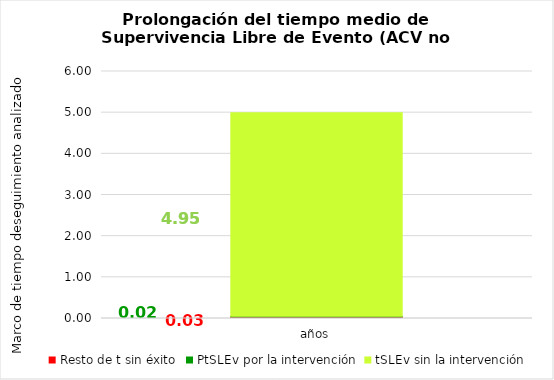
| Category | Resto de t sin éxito | PtSLEv por la intervención | tSLEv sin la intervención |
|---|---|---|---|
| años | 0.033 | 0.02 | 4.947 |